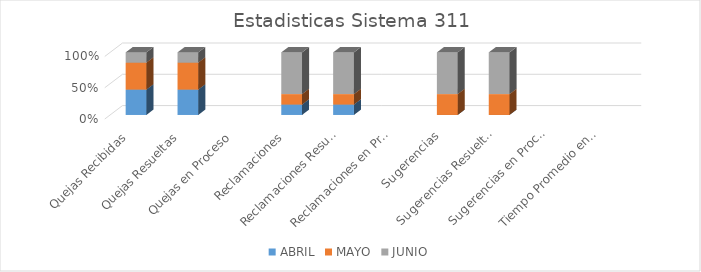
| Category | ABRIL | MAYO | JUNIO |
|---|---|---|---|
| Quejas Recibidas | 15 | 16 | 6 |
| Quejas Resueltas | 15 | 16 | 6 |
| Quejas en Proceso | 0 | 0 | 0 |
| Reclamaciones | 1 | 1 | 4 |
| Reclamaciones Resueltas | 1 | 1 | 4 |
| Reclamaciones en Proceso | 0 | 0 | 0 |
| Sugerencias | 0 | 1 | 2 |
| Sugerencias Resueltas | 0 | 1 | 2 |
| Sugerencias en Proceso | 0 | 0 | 0 |
| Tiempo Promedio en que fueron Respondidas | 0 | 0 | 0 |